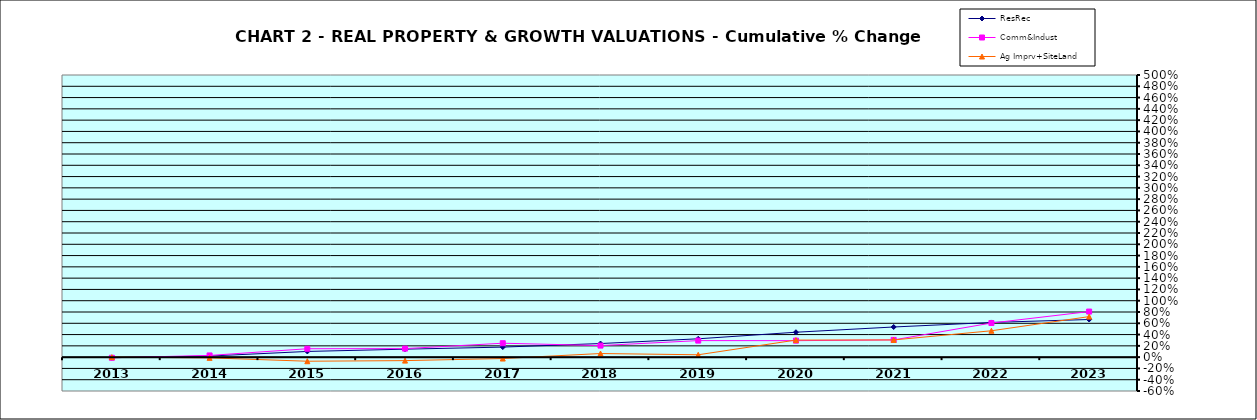
| Category | ResRec | Comm&Indust | Ag Imprv+SiteLand |
|---|---|---|---|
| 2013.0 | -0.009 | -0.011 | 0 |
| 2014.0 | 0.019 | 0.03 | -0.013 |
| 2015.0 | 0.101 | 0.149 | -0.072 |
| 2016.0 | 0.141 | 0.151 | -0.062 |
| 2017.0 | 0.178 | 0.247 | -0.025 |
| 2018.0 | 0.241 | 0.205 | 0.064 |
| 2019.0 | 0.325 | 0.293 | 0.042 |
| 2020.0 | 0.442 | 0.292 | 0.303 |
| 2021.0 | 0.534 | 0.305 | 0.305 |
| 2022.0 | 0.615 | 0.605 | 0.467 |
| 2023.0 | 0.667 | 0.808 | 0.718 |